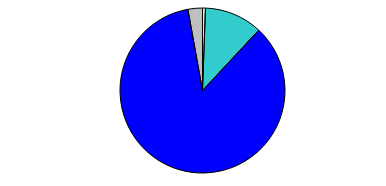
| Category | Series 0 |
|---|---|
| 0 | 0 |
| 1 | 0 |
| 2 | 1 |
| 3 | 20 |
| 4 | 150 |
| 5 | 5 |